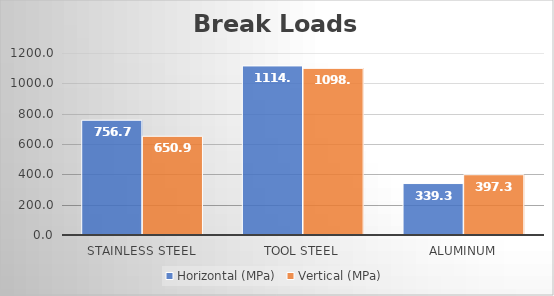
| Category | Horizontal (MPa) | Vertical (MPa) |
|---|---|---|
| Stainless Steel | 756.708 | 650.894 |
| Tool Steel | 1114.773 | 1098.72 |
| Aluminum | 339.337 | 397.305 |